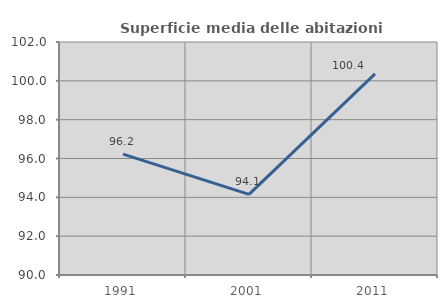
| Category | Superficie media delle abitazioni occupate |
|---|---|
| 1991.0 | 96.227 |
| 2001.0 | 94.149 |
| 2011.0 | 100.361 |